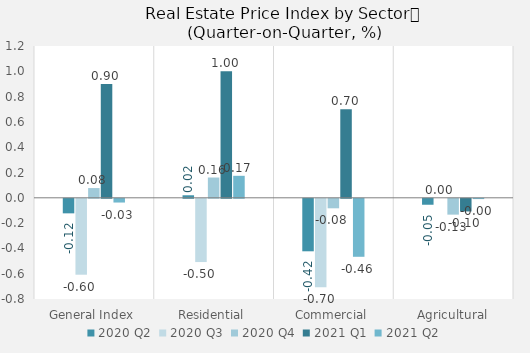
| Category | 2020 | 2021 |
|---|---|---|
| General Index | 0.077 | -0.03 |
| Residential | 0.16 | 0.174 |
| Commercial | -0.075 | -0.458 |
| Agricultural | -0.125 | -0.002 |